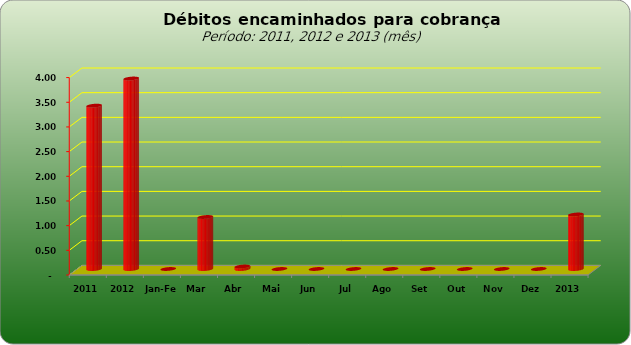
| Category |  3.309.443,02   3.859.728,44   -     1.053.903,71   50.529,60   -     -     -     -     -     -     -     -     1.104.433,31  |
|---|---|
| 2011 | 3309443.02 |
| 2012 | 3859728.44 |
| Jan-Fev | 0 |
| Mar | 1053903.71 |
| Abr | 50529.6 |
| Mai | 0 |
| Jun | 0 |
| Jul | 0 |
| Ago | 0 |
| Set | 0 |
| Out | 0 |
| Nov | 0 |
| Dez | 0 |
| 2013 | 1104433.31 |